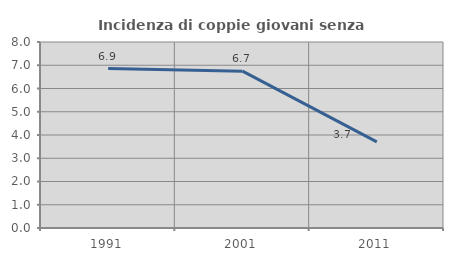
| Category | Incidenza di coppie giovani senza figli |
|---|---|
| 1991.0 | 6.859 |
| 2001.0 | 6.747 |
| 2011.0 | 3.703 |